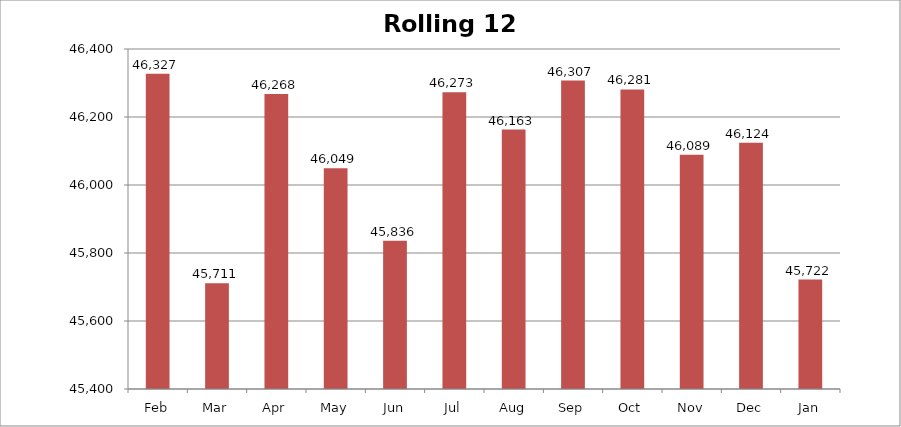
| Category | Rolling 12 Month |
|---|---|
| Feb | 46327 |
| Mar | 45711 |
| Apr | 46268 |
| May | 46049 |
| Jun | 45836 |
| Jul | 46273 |
| Aug | 46163 |
| Sep | 46307 |
| Oct | 46281 |
| Nov | 46089 |
| Dec | 46124 |
| Jan | 45722 |